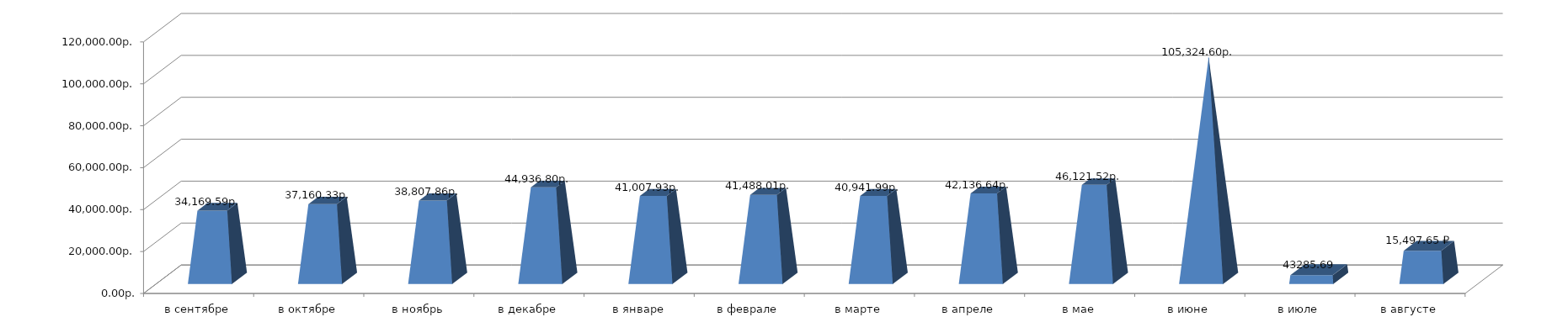
| Category | Series 0 |
|---|---|
| в сентябре | 34169.59 |
| в октябре | 37160.33 |
| в ноябрь | 38807.86 |
| в декабре | 44936.8 |
| в январе | 41007.93 |
| в феврале | 41488.01 |
| в марте | 40941.99 |
| в апреле | 42136.64 |
| в мае | 46121.52 |
| в июне | 105324.6 |
| в июле | 4069.91 |
| в августе | 15497.65 |